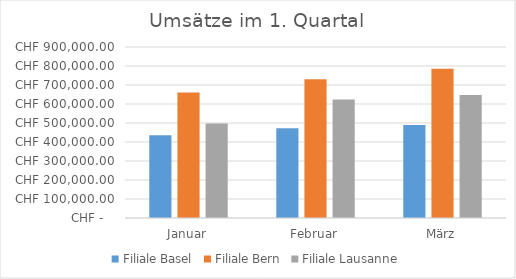
| Category | Filiale Basel | Filiale Bern | Filiale Lausanne |
|---|---|---|---|
| Januar | 436000 | 660000 | 498000 |
| Februar | 472000 | 730000 | 624000 |
| März | 490000 | 786000 | 648000 |